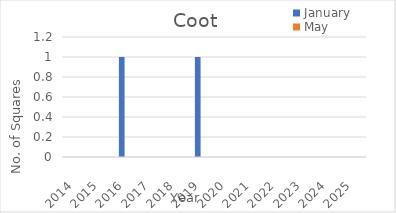
| Category | January | May |
|---|---|---|
| 2014.0 | 0 | 0 |
| 2015.0 | 0 | 0 |
| 2016.0 | 1 | 0 |
| 2017.0 | 0 | 0 |
| 2018.0 | 0 | 0 |
| 2019.0 | 1 | 0 |
| 2020.0 | 0 | 0 |
| 2021.0 | 0 | 0 |
| 2022.0 | 0 | 0 |
| 2023.0 | 0 | 0 |
| 2024.0 | 0 | 0 |
| 2025.0 | 0 | 0 |